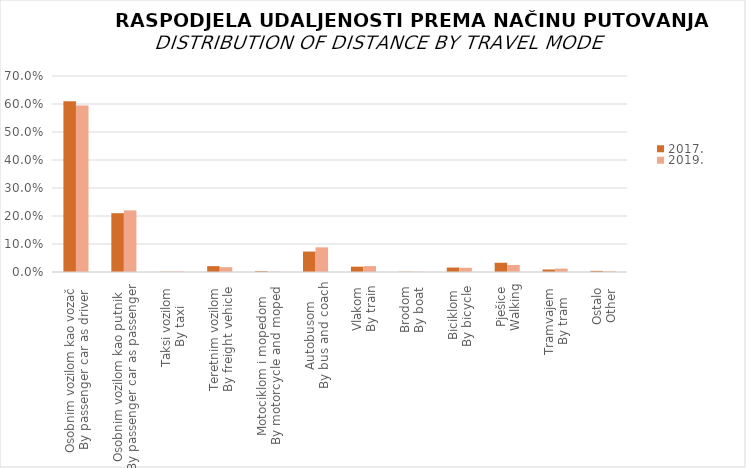
| Category | 2017. | 2019. |
|---|---|---|
| Osobnim vozilom kao vozač
By passenger car as driver | 0.61 | 0.595 |
| Osobnim vozilom kao putnik
By passenger car as passenger | 0.21 | 0.22 |
| Taksi vozilom
By taxi | 0.001 | 0.002 |
| Teretnim vozilom
By freight vehicle | 0.021 | 0.017 |
| Motociklom i mopedom
By motorcycle and moped
 | 0.003 | 0.001 |
| Autobusom
By bus and coach | 0.073 | 0.088 |
| Vlakom
By train | 0.019 | 0.021 |
| Brodom
By boat | 0.001 | 0.001 |
| Biciklom
By bicycle  | 0.016 | 0.015 |
| Pješice
Walking | 0.033 | 0.025 |
| Tramvajem
By tram | 0.009 | 0.012 |
| Ostalo
Other | 0.004 | 0.003 |